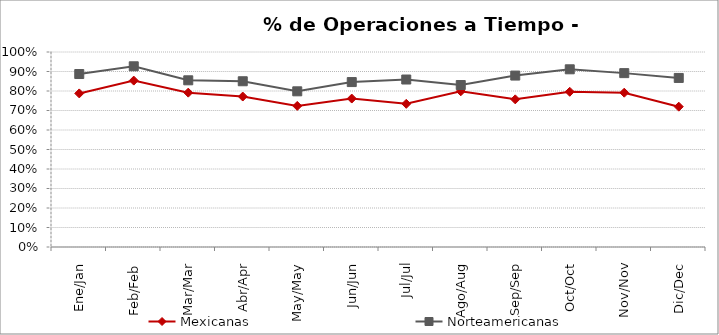
| Category | Mexicanas | Norteamericanas |
|---|---|---|
| Ene/Jan | 0.788 | 0.887 |
| Feb/Feb | 0.853 | 0.927 |
| Mar/Mar | 0.792 | 0.855 |
| Abr/Apr | 0.772 | 0.85 |
| May/May | 0.723 | 0.798 |
| Jun/Jun | 0.761 | 0.846 |
| Jul/Jul | 0.734 | 0.859 |
| Ago/Aug | 0.799 | 0.831 |
| Sep/Sep | 0.757 | 0.879 |
| Oct/Oct | 0.796 | 0.911 |
| Nov/Nov | 0.791 | 0.892 |
| Dic/Dec | 0.72 | 0.867 |